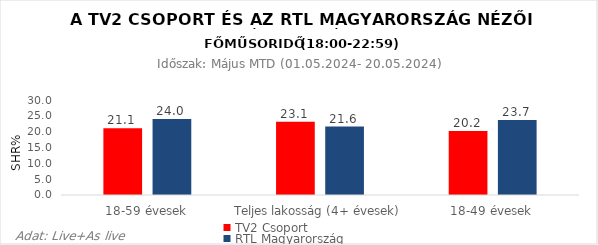
| Category | TV2 Csoport | RTL Magyarország |
|---|---|---|
| 18-59 évesek | 21.1 | 24 |
| Teljes lakosság (4+ évesek) | 23.1 | 21.6 |
| 18-49 évesek | 20.2 | 23.7 |